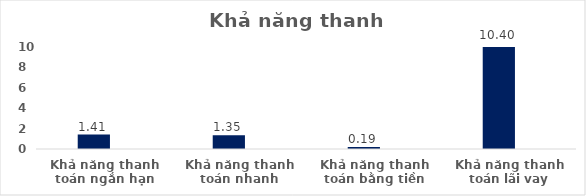
| Category | Series 0 | Series 1 | Series 2 | Series 3 | Series 4 | Series 5 |
|---|---|---|---|---|---|---|
| Khả năng thanh toán ngắn hạn | 0 | 1.414 |  |  |  |  |
| Khả năng thanh toán nhanh | 0 | 1.354 |  |  |  |  |
| Khả năng thanh toán bằng tiền | 0 | 0.194 |  |  |  |  |
| Khả năng thanh toán lãi vay | 0 | 10.402 |  |  |  |  |